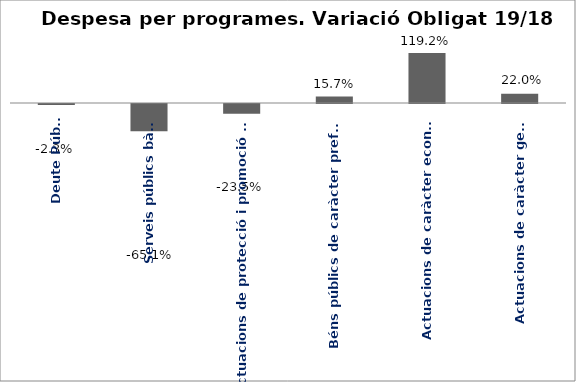
| Category | Series 0 |
|---|---|
| Deute Públic | -0.023 |
| Serveis públics bàsics | -0.651 |
| Actuacions de protecció i promoció social | -0.235 |
| Béns públics de caràcter preferent | 0.157 |
| Actuacions de caràcter econòmic | 1.192 |
| Actuacions de caràcter general | 0.22 |